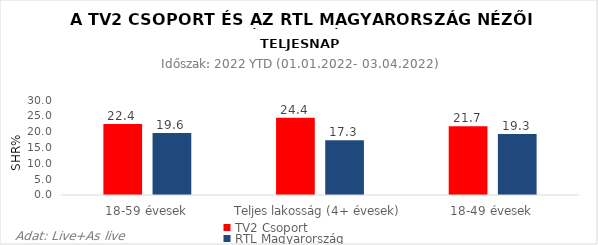
| Category | TV2 Csoport | RTL Magyarország |
|---|---|---|
| 18-59 évesek | 22.4 | 19.6 |
| Teljes lakosság (4+ évesek) | 24.4 | 17.3 |
| 18-49 évesek | 21.7 | 19.3 |